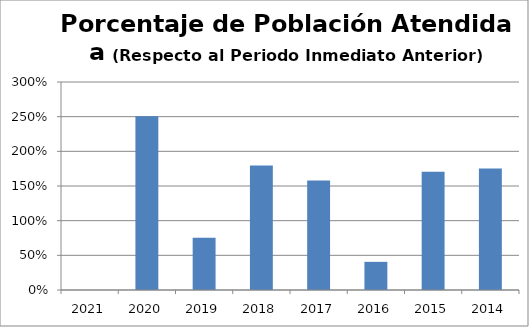
| Category | Porcentaje de Población Atendida (Respecto al Periodo Inmediato Anterior) |
|---|---|
| 2021.0 | 0 |
| 2020.0 | 2.504 |
| 2019.0 | 0.752 |
| 2018.0 | 1.795 |
| 2017.0 | 1.579 |
| 2016.0 | 0.406 |
| 2015.0 | 1.704 |
| 2014.0 | 1.751 |